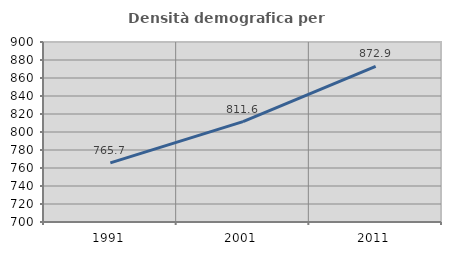
| Category | Densità demografica |
|---|---|
| 1991.0 | 765.749 |
| 2001.0 | 811.581 |
| 2011.0 | 872.925 |